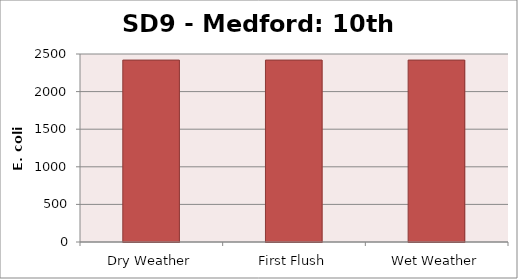
| Category | E. coli MPN |
|---|---|
| Dry Weather | 2419.2 |
| First Flush | 2419.2 |
| Wet Weather | 2419.2 |